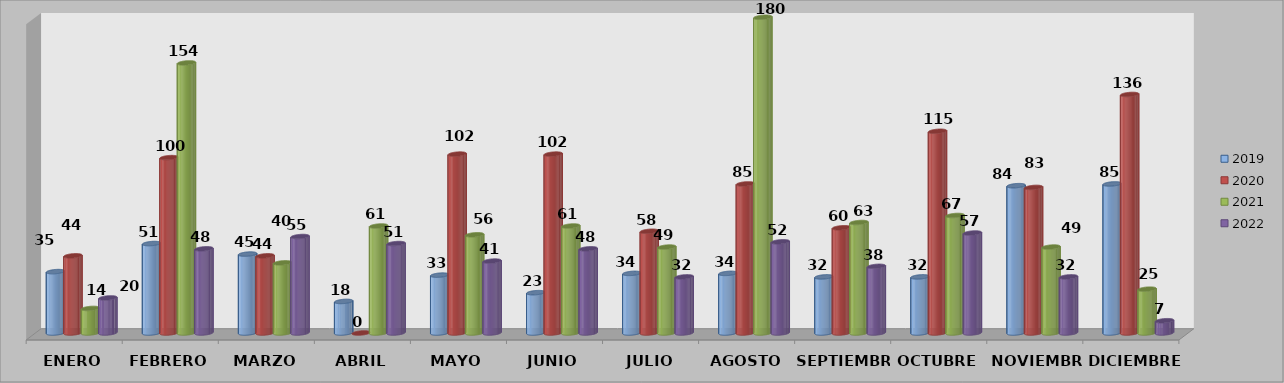
| Category | 2019 | 2020 | 2021 | 2022 |
|---|---|---|---|---|
| ENERO | 35 | 44 | 14 | 20 |
| FEBRERO | 51 | 100 | 154 | 48 |
| MARZO | 45 | 44 | 40 | 55 |
| ABRIL | 18 | 0 | 61 | 51 |
| MAYO | 33 | 102 | 56 | 41 |
| JUNIO | 23 | 102 | 61 | 48 |
| JULIO | 34 | 58 | 49 | 32 |
| AGOSTO | 34 | 85 | 180 | 52 |
| SEPTIEMBRE | 32 | 60 | 63 | 38 |
| OCTUBRE | 32 | 115 | 67 | 57 |
| NOVIEMBRE | 84 | 83 | 49 | 32 |
| DICIEMBRE | 85 | 136 | 25 | 7 |